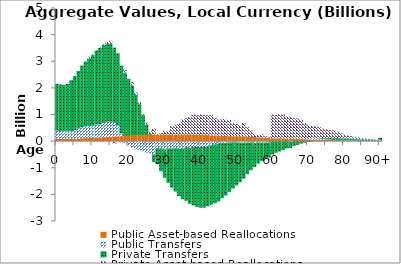
| Category | Public Asset-based Reallocations | Public Transfers | Private Transfers | Private Asset-based Reallocations |
|---|---|---|---|---|
| 0 | 88.857 | 306.45 | 1753.706 | -0.02 |
|  | 88.378 | 297.035 | 1744.276 | 0.034 |
| 2 | 88.075 | 288.334 | 1738.407 | 0 |
| 3 | 88.928 | 275.926 | 1784.627 | -0.029 |
| 4 | 91.831 | 282.905 | 1911.582 | -0.026 |
| 5 | 95.365 | 324.009 | 2027.737 | -0.035 |
| 6 | 100.306 | 376.643 | 2156.322 | -0.069 |
| 7 | 107.091 | 413.16 | 2315.521 | -0.424 |
| 8 | 113.013 | 442.204 | 2437.267 | -0.85 |
| 9 | 119.536 | 444.73 | 2530.757 | 77.325 |
| 10 | 126.325 | 451.344 | 2653.809 | 33.396 |
| 11 | 133.474 | 487.578 | 2778.092 | 20.393 |
| 12 | 140.367 | 489.329 | 2867.693 | 20.771 |
| 13 | 146.429 | 535.183 | 2926.326 | 34.38 |
| 14 | 151.366 | 581.473 | 2914.47 | 77.559 |
| 15 | 158.791 | 569.083 | 2931.995 | 109.825 |
| 16 | 167.508 | 518.545 | 2826.036 | -97.931 |
| 17 | 177.7 | 408.699 | 2712.592 | -41.545 |
| 18 | 187.738 | 107.125 | 2544.037 | -46.677 |
| 19 | 198.106 | -72.885 | 2378.806 | 90.007 |
| 20 | 206.24 | -181.862 | 2135.053 | -2.998 |
| 21 | 213.189 | -250.381 | 1872.758 | 132.756 |
| 22 | 219.507 | -306.469 | 1523.469 | 91.339 |
| 23 | 222.336 | -354.95 | 1168.521 | 79.38 |
| 24 | 224.839 | -393.746 | 775.157 | 21.249 |
| 25 | 230.966 | -434.24 | 394.178 | 65.695 |
| 26 | 234.645 | -462.112 | 38.58 | 102.21 |
| 27 | 240.938 | -497.557 | -287.666 | 237.434 |
| 28 | 239.707 | -265.945 | -587.408 | 28.929 |
| 29 | 242.906 | -275.776 | -856.746 | 65.812 |
| 30 | 249.265 | -304.559 | -1070.549 | 129.028 |
| 31 | 243.88 | -278.425 | -1289.803 | 143.249 |
| 32 | 243.32 | -272.004 | -1474.054 | 323.238 |
| 33 | 241.286 | -263.681 | -1634.087 | 368.483 |
| 34 | 245.746 | -284.223 | -1778.492 | 414.077 |
| 35 | 243.224 | -269.724 | -1908.024 | 566.41 |
| 36 | 235.418 | -233.397 | -2009.034 | 625.116 |
| 37 | 240.911 | -255.273 | -2101.651 | 665.863 |
| 38 | 236.504 | -233.751 | -2184.074 | 767.933 |
| 39 | 232.971 | -217.704 | -2255.558 | 741.964 |
| 40 | 234.6 | -225.89 | -2272.635 | 764.426 |
| 41 | 232.385 | -216.658 | -2280.787 | 750.603 |
| 42 | 225.933 | -190.43 | -2259.082 | 743.042 |
| 43 | 216.862 | -151.765 | -2232.721 | 761.876 |
| 44 | 209.741 | -127.275 | -2201.296 | 648.56 |
| 45 | 204.439 | -109.027 | -2156.211 | 617.414 |
| 46 | 194.907 | -71.125 | -2068.974 | 639.975 |
| 47 | 193.725 | -69.735 | -1969.431 | 613.893 |
| 48 | 186.525 | -50.047 | -1863.121 | 610.925 |
| 49 | 182.563 | -43.475 | -1737.688 | 492.271 |
| 50 | 181.013 | -47.488 | -1614.095 | 458.972 |
| 51 | 180.749 | -55.075 | -1488.493 | 409.075 |
| 52 | 179.574 | -63.452 | -1343.033 | 499.62 |
| 53 | 169.116 | -51.305 | -1191.522 | 360.898 |
| 54 | 159.42 | -52.157 | -1038.254 | 236.328 |
| 55 | 155.31 | -72.765 | -906.793 | 122.498 |
| 56 | 139.88 | -45.485 | -792.812 | 86.83 |
| 57 | 136.44 | -57.224 | -695.667 | 130.958 |
| 58 | 130.702 | -53.838 | -617.26 | 56.156 |
| 59 | 127.02 | -48.694 | -558.732 | -82.749 |
| 60 | 110.144 | 10.359 | -499.491 | 875.175 |
| 61 | 106.525 | 13.955 | -440.883 | 859.183 |
| 62 | 108.905 | -6.589 | -384.581 | 912.994 |
| 63 | 105.242 | -6.16 | -328.765 | 895.955 |
| 64 | 99.292 | 2.772 | -275.159 | 828.712 |
| 65 | 103.532 | -33.42 | -222.358 | 820.299 |
| 66 | 92.779 | 2.237 | -179.144 | 765.474 |
| 67 | 88.107 | 8.23 | -138.419 | 755.754 |
| 68 | 79.479 | 25.806 | -96.682 | 692.714 |
| 69 | 73.744 | 25.095 | -62.789 | 577.146 |
| 70 | 68.721 | 23.751 | -37.078 | 516.489 |
| 71 | 60.425 | 39.895 | -17.182 | 473.286 |
| 72 | 59.439 | 25.311 | 2.71 | 485.545 |
| 73 | 53.712 | 27.53 | 19.2 | 421.077 |
| 74 | 46.784 | 36.359 | 31.417 | 362.473 |
| 75 | 46.396 | 16.312 | 45.256 | 340.141 |
| 76 | 42.12 | 13.775 | 61.678 | 295.627 |
| 77 | 41.189 | -0.841 | 66.45 | 296.897 |
| 78 | 36.886 | -1.889 | 72.612 | 252.411 |
| 79 | 31.849 | 0.773 | 75.796 | 184.739 |
| 80 | 28.444 | -2.599 | 75.748 | 143.811 |
| 81 | 22.456 | 7.109 | 71.639 | 113.546 |
| 82 | 20.361 | 0.864 | 66.945 | 97.583 |
| 83 | 17.548 | -0.11 | 60.918 | 86.237 |
| 84 | 14.086 | 3.121 | 54.001 | 69.728 |
| 85 | 11.708 | 2.706 | 48.361 | 56.064 |
| 86 | 8.185 | 8.279 | 42.477 | 40.624 |
| 87 | 5.418 | 11.555 | 36.448 | 28.154 |
| 88 | 3.783 | 11.662 | 31.416 | 20.266 |
| 89 | 2.357 | 11.732 | 26.248 | 9.767 |
| 90+ | 6.168 | 34.237 | 76.085 | 16.34 |